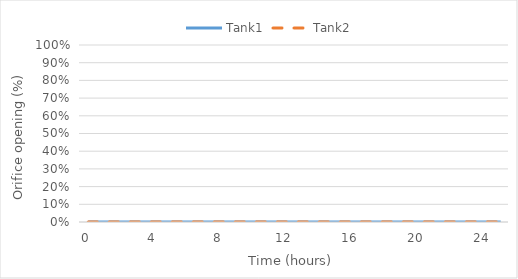
| Category | Tank1 | Tank2 |
|---|---|---|
| 0.0 | 0 | 0 |
| 1.0 | 0 | 0 |
| 2.0 | 0 | 0 |
| 3.0 | 0 | 0 |
| 4.0 | 0 | 0 |
| 5.0 | 0 | 0 |
| 6.0 | 0 | 0 |
| 7.0 | 0 | 0 |
| 8.0 | 0 | 0 |
| 9.0 | 0 | 0 |
| 10.0 | 0 | 0 |
| 11.0 | 0 | 0 |
| 12.0 | 0 | 0 |
| 13.0 | 0 | 0 |
| 14.0 | 0 | 0 |
| 15.0 | 0 | 0 |
| 16.0 | 0 | 0 |
| 17.0 | 0 | 0 |
| 18.0 | 0 | 0 |
| 19.0 | 0 | 0 |
| 20.0 | 0 | 0 |
| 21.0 | 0 | 0 |
| 22.0 | 0 | 0 |
| 23.0 | 0 | 0 |
| 24.0 | 0 | 0 |
| 25.0 | 0 | 0 |